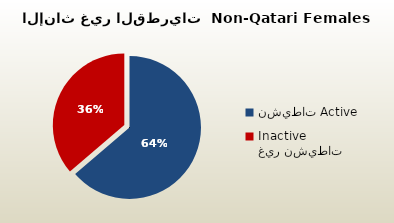
| Category | الاناث غير القطريات  Non-Qatari Females |
|---|---|
| نشيطات Active | 243966 |
| غير نشيطات Inactive | 138725 |